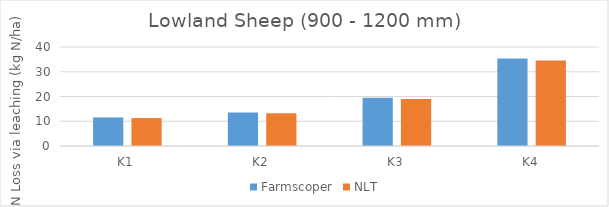
| Category | Farmscoper | NLT |
|---|---|---|
| K1 | 11.541 | 11.28 |
| K2 | 13.525 | 13.22 |
| K3 | 19.478 | 19.03 |
| K4 | 35.352 | 34.53 |